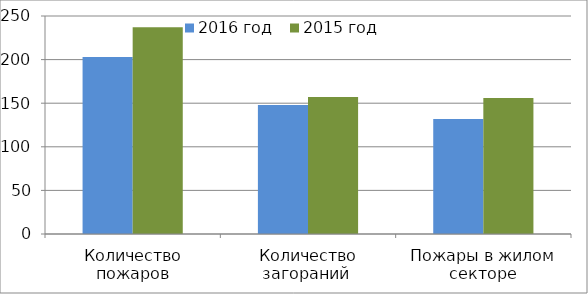
| Category | 2016 год | 2015 год |
|---|---|---|
| Количество пожаров | 203 | 237 |
| Количество загораний  | 148 | 157 |
| Пожары в жилом секторе | 132 | 156 |